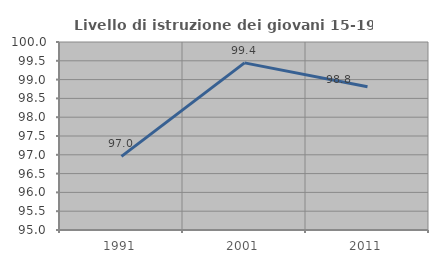
| Category | Livello di istruzione dei giovani 15-19 anni |
|---|---|
| 1991.0 | 96.959 |
| 2001.0 | 99.444 |
| 2011.0 | 98.81 |